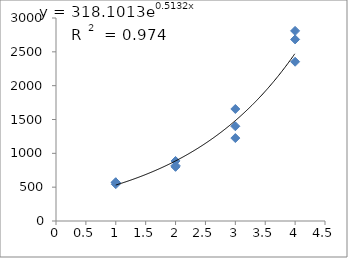
| Category | Series 0 |
|---|---|
| 1.0 | 572.247 |
| 1.0 | 544.421 |
| 1.0 | 571.037 |
| 2.0 | 887.199 |
| 2.0 | 818.261 |
| 2.0 | 800.278 |
| 3.0 | 1225.593 |
| 3.0 | 1400.199 |
| 3.0 | 1655.626 |
| 4.0 | 2353.789 |
| 4.0 | 2809.548 |
| 4.0 | 2683.63 |